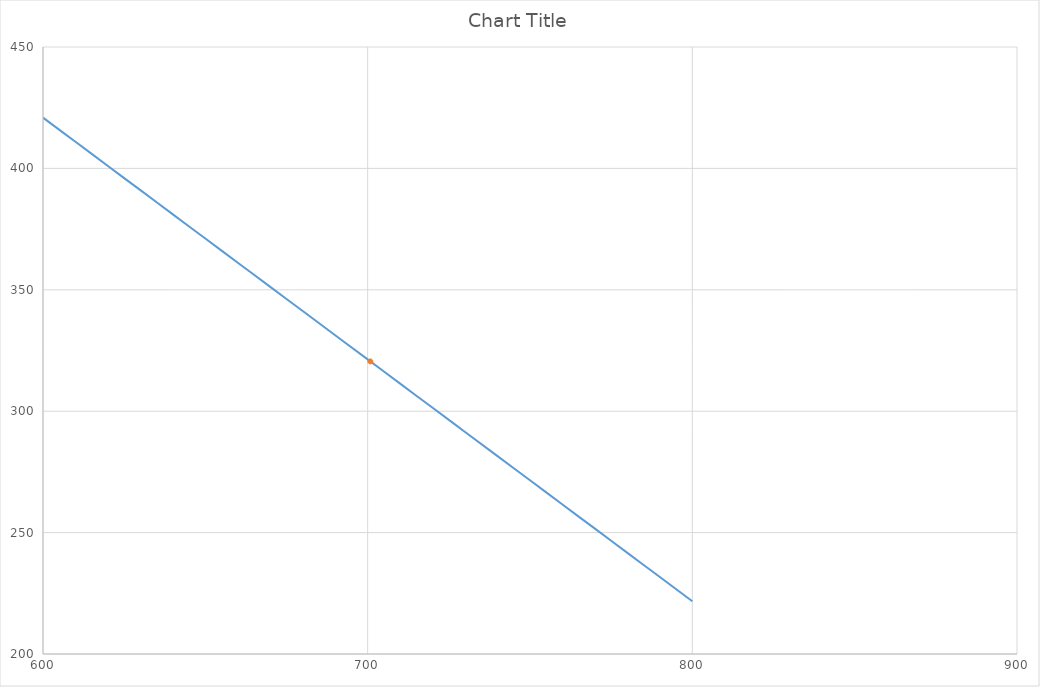
| Category | Series 0 |
|---|---|
| 600.0 | 420.905 |
| 610.0 | 410.947 |
| 620.0 | 400.989 |
| 630.0 | 391.031 |
| 640.0 | 381.073 |
| 650.0 | 371.115 |
| 660.0 | 361.157 |
| 670.0 | 351.199 |
| 680.0 | 341.241 |
| 690.0 | 331.283 |
| 700.0 | 321.325 |
| 710.0 | 311.367 |
| 720.0 | 301.408 |
| 730.0 | 291.45 |
| 740.0 | 281.492 |
| 750.0 | 271.534 |
| 760.0 | 261.576 |
| 770.0 | 251.618 |
| 780.0 | 241.66 |
| 790.0 | 231.702 |
| 800.0 | 221.744 |